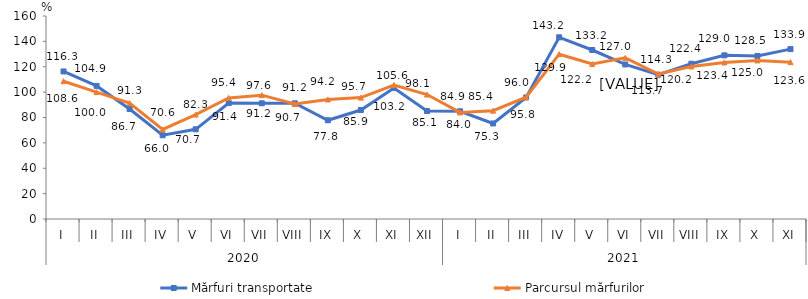
| Category | Mărfuri transportate | Parcursul mărfurilor |
|---|---|---|
| 0 | 116.3 | 108.6 |
| 1 | 104.9 | 100 |
| 2 | 86.7 | 91.3 |
| 3 | 66 | 70.6 |
| 4 | 70.7 | 82.3 |
| 5 | 91.4 | 95.4 |
| 6 | 91.2 | 97.6 |
| 7 | 91.2 | 90.7 |
| 8 | 77.8 | 94.2 |
| 9 | 85.9 | 95.7 |
| 10 | 103.2 | 105.6 |
| 11 | 85.1 | 98.1 |
| 12 | 84.9 | 84 |
| 13 | 75.3 | 85.4 |
| 14 | 95.8 | 96 |
| 15 | 143.2 | 129.9 |
| 16 | 133.2 | 122.2 |
| 17 | 121.8 | 127 |
| 18 | 113.7 | 114.3 |
| 19 | 122.4 | 120.2 |
| 20 | 129 | 123.4 |
| 21 | 128.5 | 125 |
| 22 | 133.9 | 123.6 |